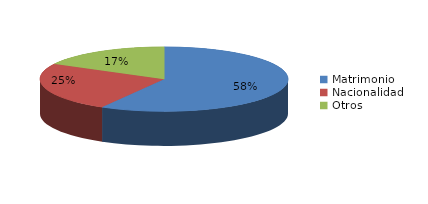
| Category | Series 0 |
|---|---|
| Matrimonio | 190 |
| Nacionalidad | 80 |
| Otros | 56 |